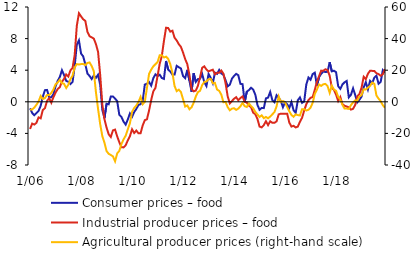
| Category | Consumer prices – food | Industrial producer prices – food |
|---|---|---|
|  1/06 | -0.828 | -3.441 |
| 2 | -1.421 | -2.759 |
| 3 | -1.696 | -2.882 |
| 4 | -1.43 | -2.661 |
| 5 | -1.15 | -1.973 |
| 6 | -0.503 | -2.091 |
| 7 | 0.647 | -1.04 |
| 8 | 1.471 | -0.808 |
| 9 | 1.502 | 0.116 |
| 10 | 0.554 | 0.462 |
| 11 | 0.57 | -0.116 |
| 12 | 0.968 | 0.583 |
|  1/07 | 1.971 | 1.16 |
| 2 | 2.65 | 1.619 |
| 3 | 3.141 | 1.854 |
| 4 | 3.997 | 2.546 |
| 5 | 3.39 | 2.889 |
| 6 | 2.654 | 3.461 |
| 7 | 2.532 | 3.2 |
| 8 | 2.252 | 3.976 |
| 9 | 2.508 | 4.294 |
| 10 | 4.533 | 5.927 |
| 11 | 7.242 | 9.626 |
| 12 | 7.772 | 11.208 |
|  1/08 | 6.105 | 10.812 |
| 2 | 5.751 | 10.444 |
| 3 | 4.746 | 10.249 |
| 4 | 3.573 | 8.853 |
| 5 | 3.267 | 8.302 |
| 6 | 2.885 | 8.161 |
| 7 | 3.338 | 7.996 |
| 8 | 3.038 | 7.299 |
| 9 | 3.424 | 6.322 |
| 10 | 2.16 | 3.415 |
| 11 | -1.008 | -0.317 |
| 12 | -2.068 | -2.207 |
|  1/09 | -0.256 | -3.262 |
| 2 | -0.312 | -4.112 |
| 3 | 0.672 | -4.45 |
| 4 | 0.673 | -3.621 |
| 5 | 0.405 | -3.52 |
| 6 | 0.081 | -4.379 |
| 7 | -1.648 | -5.113 |
| 8 | -1.916 | -5.752 |
| 9 | -2.513 | -5.771 |
| 10 | -2.887 | -5.5 |
| 11 | -2.231 | -4.879 |
| 12 | -1.468 | -4.344 |
|  1/10 | -1.902 | -3.482 |
| 2 | -1.296 | -3.952 |
| 3 | -0.908 | -3.641 |
| 4 | -0.388 | -3.983 |
| 5 | -0.309 | -3.987 |
| 6 | 0.127 | -2.992 |
| 7 | 2.177 | -2.322 |
| 8 | 2.294 | -2.217 |
| 9 | 2.51 | -1.106 |
| 10 | 2.054 | 0.221 |
| 11 | 2.989 | 1.325 |
| 12 | 3.475 | 1.76 |
|  1/11 | 3.256 | 3.268 |
| 2 | 3.427 | 4.81 |
| 3 | 3.015 | 5.784 |
| 4 | 2.898 | 7.709 |
| 5 | 5.166 | 9.377 |
| 6 | 4.073 | 9.337 |
| 7 | 3.827 | 8.878 |
| 8 | 3.443 | 9 |
| 9 | 3.441 | 8.115 |
| 10 | 4.551 | 7.766 |
| 11 | 4.369 | 7.293 |
| 12 | 4.224 | 6.95 |
|  1/12 | 3.258 | 6.233 |
| 2 | 2.991 | 5.401 |
| 3 | 4.047 | 4.763 |
| 4 | 2.666 | 3.39 |
| 5 | 1.279 | 1.633 |
| 6 | 3.62 | 1.323 |
| 7 | 2.522 | 1.423 |
| 8 | 2.878 | 2.028 |
| 9 | 2.924 | 3.13 |
| 10 | 3.51 | 4.307 |
| 11 | 2.475 | 4.485 |
| 12 | 1.995 | 4.086 |
|  1/13 | 3.52 | 3.852 |
| 2 | 3.044 | 3.965 |
| 3 | 2.366 | 4.062 |
| 4 | 3.689 | 3.474 |
| 5 | 3.538 | 3.677 |
| 6 | 4.036 | 3.673 |
| 7 | 3.59 | 3.957 |
| 8 | 3.416 | 3.551 |
| 9 | 2.734 | 2.358 |
| 10 | 1.957 | 0.684 |
| 11 | 2.165 | -0.195 |
| 12 | 2.927 | 0.098 |
|  1/14 | 3.276 | 0.387 |
| 2 | 3.535 | 0.581 |
| 3 | 3.362 | 0.194 |
| 4 | 2.273 | 0.487 |
| 5 | 2.236 | 0.681 |
| 6 | -0.023 | 0 |
| 7 | 1.279 | -0.097 |
| 8 | 1.49 | -0.486 |
| 9 | 1.774 | -0.682 |
| 10 | 1.546 | -1.373 |
| 11 | 0.903 | -1.575 |
| 12 | -0.395 | -2.17 |
|  1/15 | -1.011 | -3.138 |
| 2 | -0.772 | -3.24 |
| 3 | -0.801 | -2.95 |
| 4 | 0.433 | -2.457 |
| 5 | 0.526 | -2.95 |
| 6 | 1.244 | -2.467 |
| 7 | 0.226 | -2.656 |
| 8 | -0.052 | -2.664 |
| 9 | 0.831 | -2.474 |
| 10 | 0.504 | -1.592 |
| 11 | 0.114 | -1.499 |
| 12 | -0.693 | -1.507 |
|  1/16 | -0.062 | -1.505 |
| 2 | -0.32 | -1.508 |
| 3 | -0.765 | -2.629 |
| 4 | -0.032 | -3.133 |
| 5 | -1.057 | -3.04 |
| 6 | -1.408 | -3.249 |
| 7 | 0.197 | -3.139 |
| 8 | 0.554 | -2.532 |
| 9 | -0.132 | -2.024 |
| 10 | 0.038 | -1.109 |
| 11 | 2.196 | -0.303 |
| 12 | 3.065 | 0.202 |
|  1/17 | 2.797 | 0.504 |
| 2 | 3.514 | 0.606 |
| 3 | 3.686 | 1.525 |
| 4 | 2.026 | 2.534 |
| 5 | 3.121 | 3.239 |
| 6 | 3.544 | 3.946 |
| 7 | 3.84 | 3.934 |
| 8 | 3.766 | 4.119 |
| 9 | 3.807 | 4.009 |
| 10 | 5.012 | 3.292 |
| 11 | 3.854 | 1.802 |
| 12 | 3.932 | 1.504 |
|  1/18 | 3.748 | 0.901 |
| 2 | 1.976 | 0.101 |
| 3 | 1.638 | 0.604 |
| 4 | 2.192 | -0.301 |
| 5 | 2.463 | -0.499 |
| 6 | 2.637 | -0.597 |
| 7 | 0.567 | -0.695 |
| 8 | 0.878 | -0.989 |
| 9 | 1.706 | -0.888 |
| 10 | 0.864 | -0.393 |
| 11 | -0.069 | 0.692 |
| 12 | 0.264 | 0.99 |
|  1/19 | 0.657 | 1.779 |
| 2 | 1.833 | 3.169 |
| 3 | 2.48 | 2.867 |
| 4 | 1.569 | 3.551 |
| 5 | 2.65 | 3.926 |
| 6 | 2.356 | 3.914 |
| 7 | 3.053 | 3.907 |
| 8 | 3.3 | 3.612 |
| 9 | 2.286 | 3.506 |
| 10 | 2.52 | 3.295 |
| 11 | 4.013 | 3.485 |
| 12 | 3.715 | 4.149 |